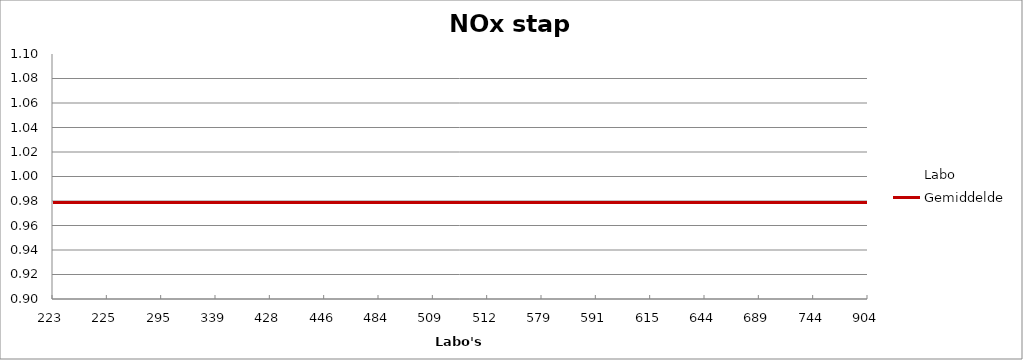
| Category | Labo | Gemiddelde |
|---|---|---|
| 223.0 | 1.013 | 0.979 |
| 225.0 | 0.951 | 0.979 |
| 295.0 | 1.058 | 0.979 |
| 339.0 | 0.946 | 0.979 |
| 428.0 | 1.007 | 0.979 |
| 446.0 | 0.951 | 0.979 |
| 484.0 | 0.974 | 0.979 |
| 509.0 | 0.99 | 0.979 |
| 512.0 | 1.018 | 0.979 |
| 579.0 | 1.007 | 0.979 |
| 591.0 | 0.974 | 0.979 |
| 615.0 | 0.935 | 0.979 |
| 644.0 | 1.018 | 0.979 |
| 689.0 | 0.94 | 0.979 |
| 744.0 | 0.951 | 0.979 |
| 904.0 | 0.951 | 0.979 |